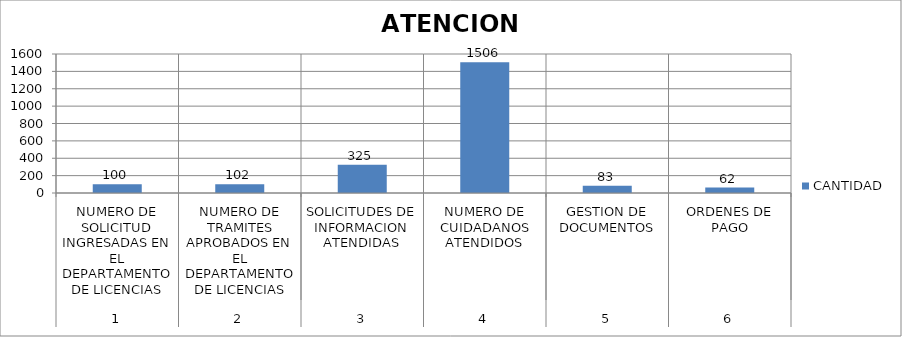
| Category | CANTIDAD |
|---|---|
| 0 | 100 |
| 1 | 102 |
| 2 | 325 |
| 3 | 1506 |
| 4 | 83 |
| 5 | 62 |